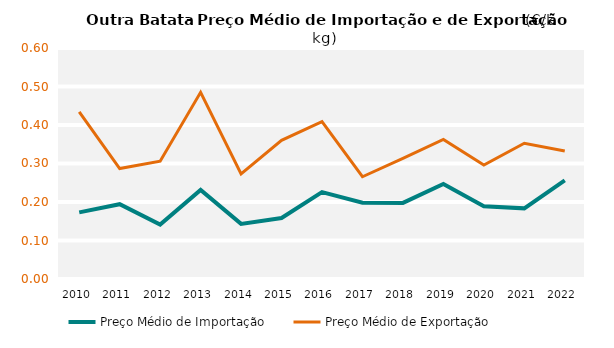
| Category | Preço Médio de Importação | Preço Médio de Exportação |
|---|---|---|
| 2010.0 | 0.173 | 0.434 |
| 2011.0 | 0.194 | 0.287 |
| 2012.0 | 0.141 | 0.306 |
| 2013.0 | 0.231 | 0.485 |
| 2014.0 | 0.143 | 0.273 |
| 2015.0 | 0.158 | 0.36 |
| 2016.0 | 0.226 | 0.409 |
| 2017.0 | 0.198 | 0.266 |
| 2018.0 | 0.198 | 0.313 |
| 2019.0 | 0.247 | 0.363 |
| 2020.0 | 0.189 | 0.296 |
| 2021.0 | 0.183 | 0.352 |
| 2022.0 | 0.256 | 0.332 |